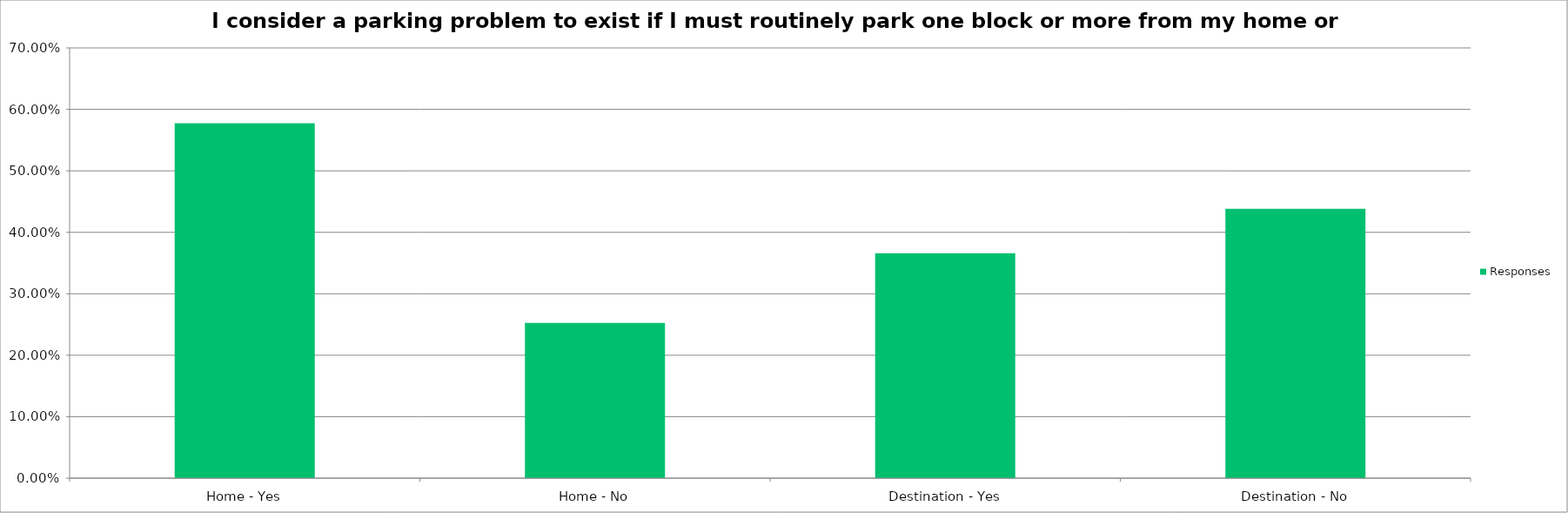
| Category | Responses |
|---|---|
| Home - Yes | 0.577 |
| Home - No | 0.253 |
| Destination - Yes | 0.366 |
| Destination - No | 0.438 |